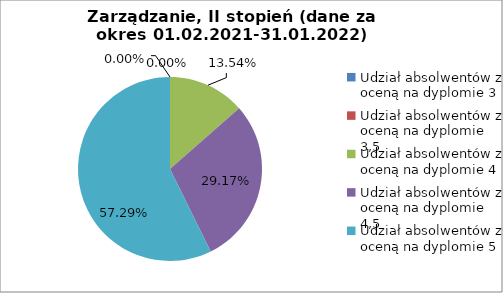
| Category | Series 0 |
|---|---|
| Udział absolwentów z oceną na dyplomie 3 | 0 |
| Udział absolwentów z oceną na dyplomie 3,5 | 0 |
| Udział absolwentów z oceną na dyplomie 4 | 13.542 |
| Udział absolwentów z oceną na dyplomie 4,5 | 29.167 |
| Udział absolwentów z oceną na dyplomie 5 | 57.292 |